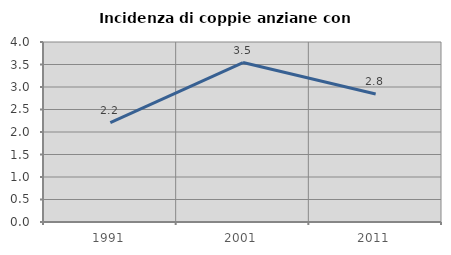
| Category | Incidenza di coppie anziane con figli |
|---|---|
| 1991.0 | 2.211 |
| 2001.0 | 3.544 |
| 2011.0 | 2.843 |